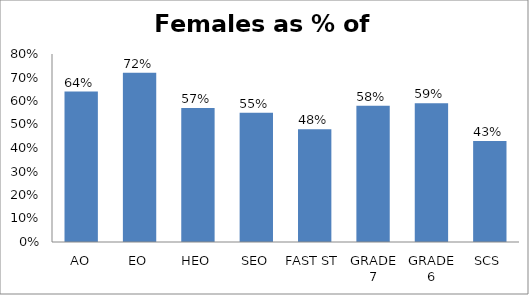
| Category | Female |
|---|---|
| AO | 0.64 |
| EO | 0.72 |
| HEO | 0.57 |
| SEO | 0.55 |
| FAST ST | 0.48 |
| GRADE 7 | 0.58 |
| GRADE 6 | 0.59 |
| SCS | 0.43 |